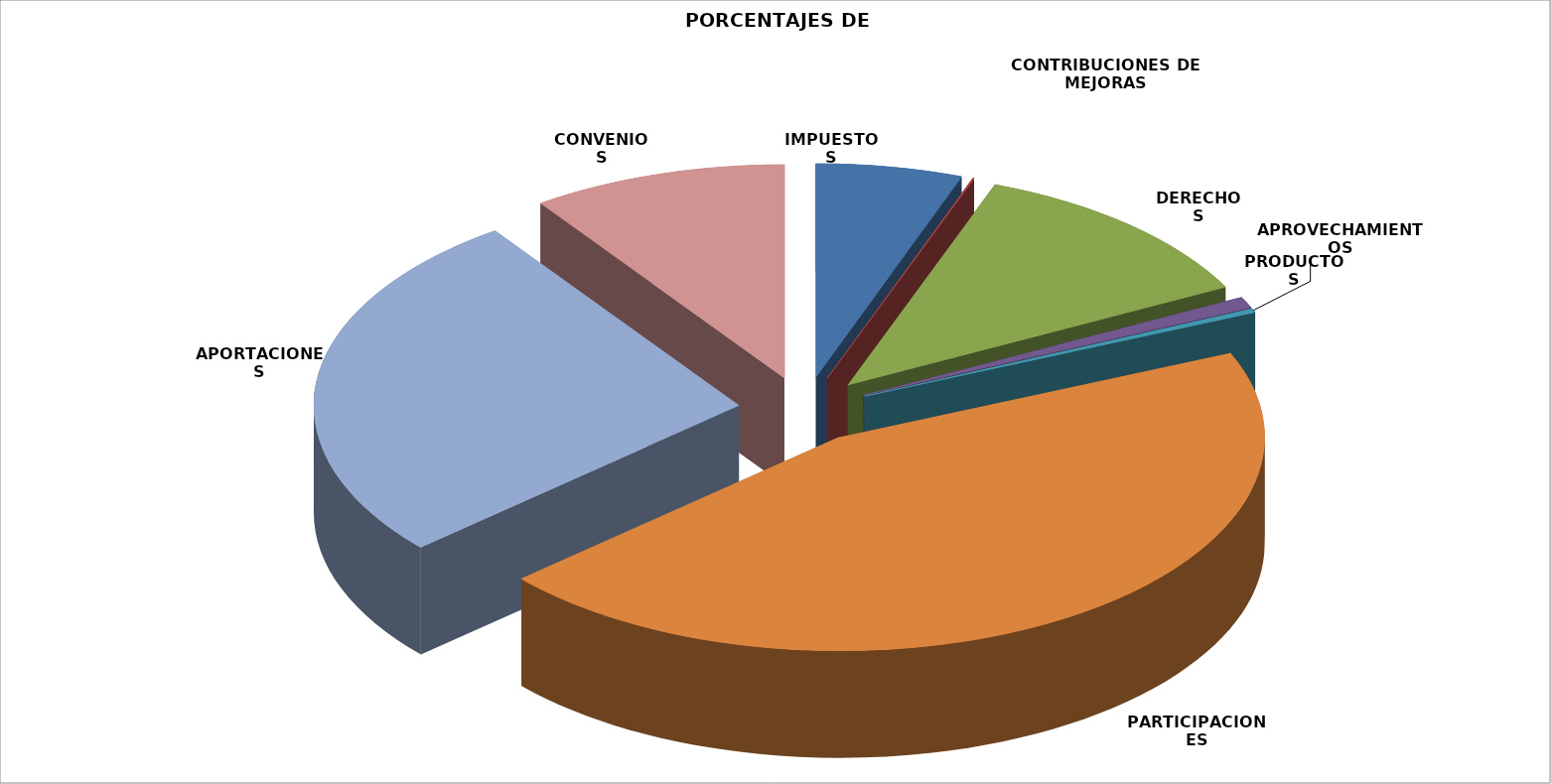
| Category | TOTAL | PORCENTAJE |
|---|---|---|
| IMPUESTOS | 2034609.84 | 0.056 |
| CONTRIBUCIONES DE MEJORAS | 20000 | 0.001 |
| DERECHOS | 4304004.261 | 0.118 |
| PRODUCTOS | 308428.47 | 0.008 |
| APROVECHAMIENTOS | 107386.96 | 0.003 |
| PARTICIPACIONES | 16400346.2 | 0.449 |
| APORTACIONES | 9797496.81 | 0.268 |
| CONVENIOS | 3552623.26 | 0.097 |